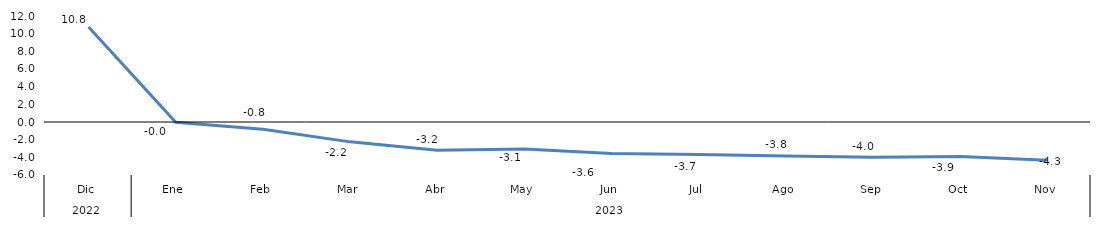
| Category | Bogotá |
|---|---|
| 0 | 10.766 |
| 1 | -0.036 |
| 2 | -0.821 |
| 3 | -2.248 |
| 4 | -3.206 |
| 5 | -3.05 |
| 6 | -3.565 |
| 7 | -3.673 |
| 8 | -3.838 |
| 9 | -3.986 |
| 10 | -3.913 |
| 11 | -4.342 |